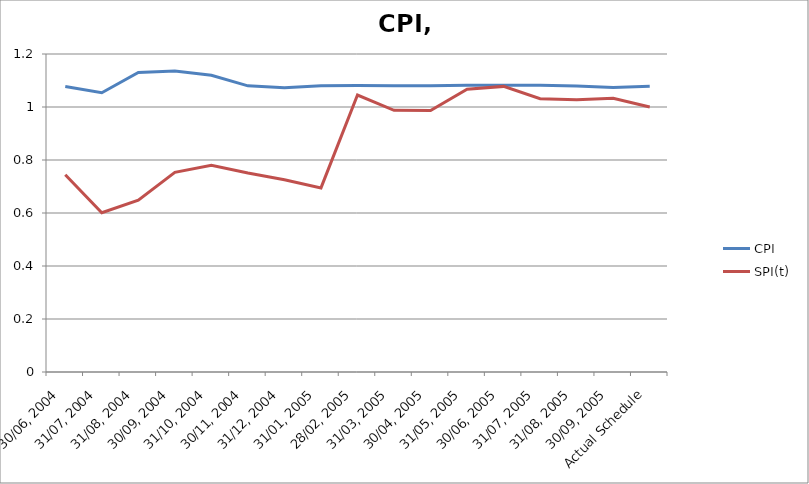
| Category | CPI | SPI(t) |
|---|---|---|
| 30/06, 2004 | 1.077 | 0.745 |
| 31/07, 2004 | 1.054 | 0.601 |
| 31/08, 2004 | 1.13 | 0.649 |
| 30/09, 2004 | 1.136 | 0.753 |
| 31/10, 2004 | 1.12 | 0.78 |
| 30/11, 2004 | 1.08 | 0.751 |
| 31/12, 2004 | 1.073 | 0.725 |
| 31/01, 2005 | 1.08 | 0.695 |
| 28/02, 2005 | 1.081 | 1.045 |
| 31/03, 2005 | 1.08 | 0.988 |
| 30/04, 2005 | 1.081 | 0.987 |
| 31/05, 2005 | 1.082 | 1.067 |
| 30/06, 2005 | 1.082 | 1.078 |
| 31/07, 2005 | 1.082 | 1.031 |
| 31/08, 2005 | 1.079 | 1.027 |
| 30/09, 2005 | 1.074 | 1.033 |
| Actual Schedule | 1.079 | 1 |